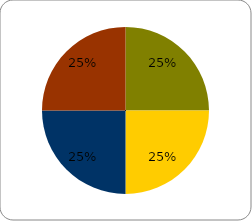
| Category | Series 0 |
|---|---|
| Weizen | 0.25 |
| Mais | 0.25 |
| Raps | 0.25 |
| Baumwolle | 0.25 |